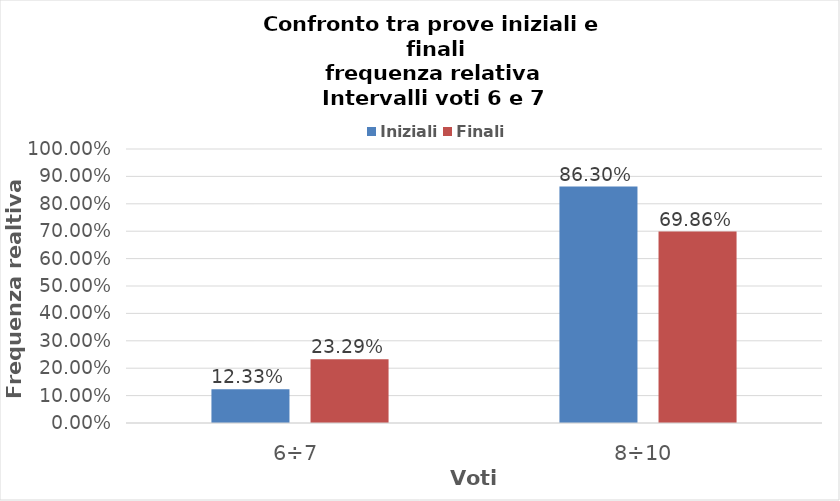
| Category | Iniziali | Finali |
|---|---|---|
| 6÷7 | 0.123 | 0.233 |
| 8÷10 | 0.863 | 0.699 |